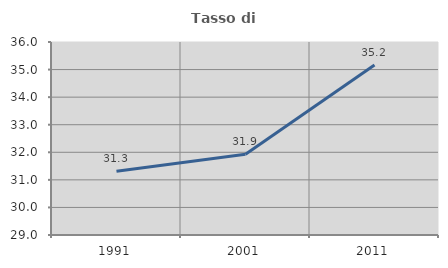
| Category | Tasso di occupazione   |
|---|---|
| 1991.0 | 31.315 |
| 2001.0 | 31.927 |
| 2011.0 | 35.167 |